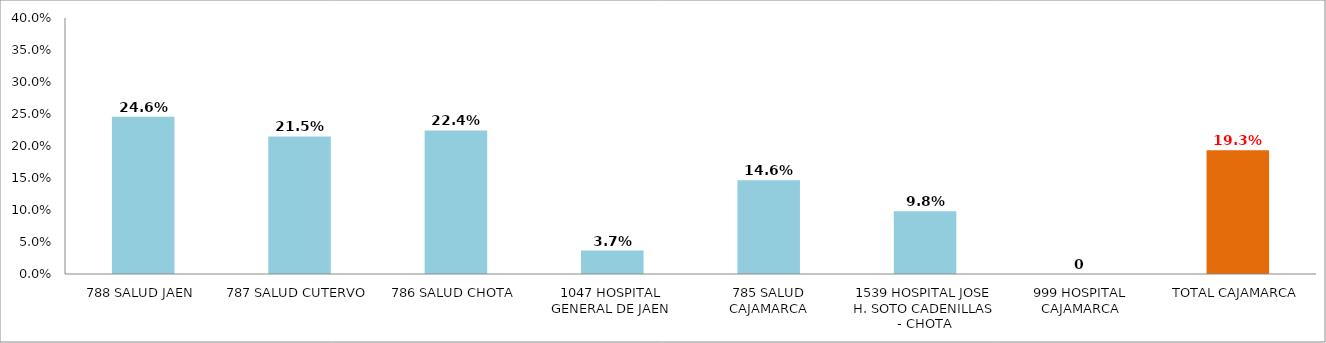
| Category | % AFILIADAS CON CONSEJERÍA EN PPFF 
(QUINTIL 1 y 2) |
|---|---|
| 788 SALUD JAEN | 0.246 |
| 787 SALUD CUTERVO | 0.215 |
| 786 SALUD CHOTA | 0.224 |
| 1047 HOSPITAL GENERAL DE JAEN | 0.037 |
| 785 SALUD CAJAMARCA | 0.146 |
| 1539 HOSPITAL JOSE H. SOTO CADENILLAS - CHOTA | 0.098 |
| 999 HOSPITAL CAJAMARCA | 0 |
| TOTAL CAJAMARCA | 0.193 |